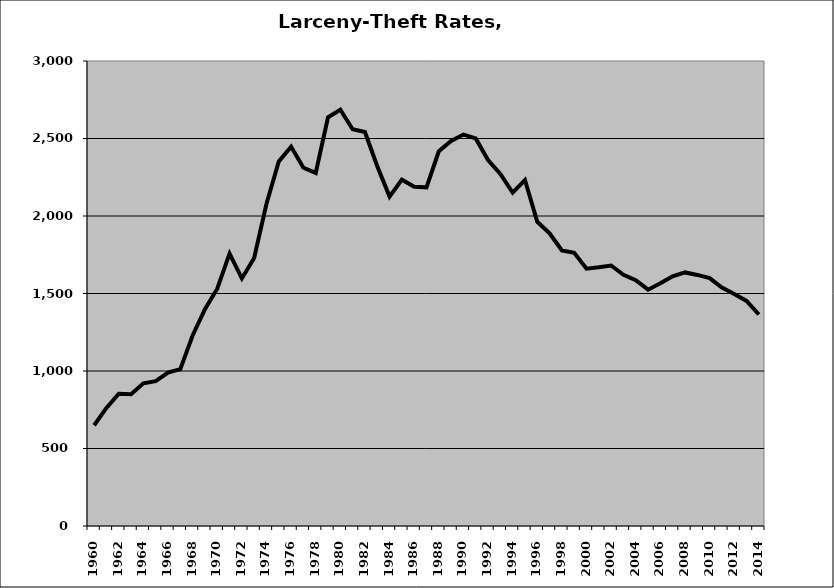
| Category | Larceny-Theft |
|---|---|
| 1960.0 | 650.063 |
| 1961.0 | 762.037 |
| 1962.0 | 853.536 |
| 1963.0 | 850.556 |
| 1964.0 | 920.363 |
| 1965.0 | 934.873 |
| 1966.0 | 989.114 |
| 1967.0 | 1011.566 |
| 1968.0 | 1229.042 |
| 1969.0 | 1399.323 |
| 1970.0 | 1531.225 |
| 1971.0 | 1756.877 |
| 1972.0 | 1597.114 |
| 1973.0 | 1729.202 |
| 1974.0 | 2078.828 |
| 1975.0 | 2351.716 |
| 1976.0 | 2446.807 |
| 1977.0 | 2311.346 |
| 1978.0 | 2277.78 |
| 1979.0 | 2637.112 |
| 1980.0 | 2685.776 |
| 1981.0 | 2559.636 |
| 1982.0 | 2541.654 |
| 1983.0 | 2321.536 |
| 1984.0 | 2125.112 |
| 1985.0 | 2234.421 |
| 1986.0 | 2189.095 |
| 1987.0 | 2185.124 |
| 1988.0 | 2417.527 |
| 1989.0 | 2484.779 |
| 1990.0 | 2525.304 |
| 1991.0 | 2500.5 |
| 1992.0 | 2360.954 |
| 1993.0 | 2271.257 |
| 1994.0 | 2151.333 |
| 1995.0 | 2232.236 |
| 1996.0 | 1962.607 |
| 1997.0 | 1887.774 |
| 1998.0 | 1777.696 |
| 1999.0 | 1762.624 |
| 2000.0 | 1660.472 |
| 2001.0 | 1668.775 |
| 2002.0 | 1680.557 |
| 2003.0 | 1620.922 |
| 2004.0 | 1585.749 |
| 2005.0 | 1524.536 |
| 2006.0 | 1565.76 |
| 2007.0 | 1611.177 |
| 2008.0 | 1635.92 |
| 2009.0 | 1619.741 |
| 2010.0 | 1598.823 |
| 2011.0 | 1538.428 |
| 2012.0 | 1496.591 |
| 2013.0 | 1452.36 |
| 2014.0 | 1364.528 |